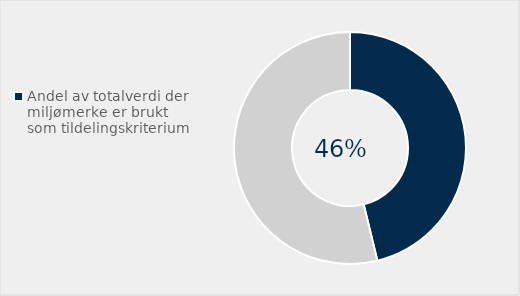
| Category | Series 0 |
|---|---|
| Andel av totalverdi der miljømerke er brukt som tildelingskriterium | 0.462 |
| Ikke brukt miljø miljø som tildelingskritierum | 0.538 |